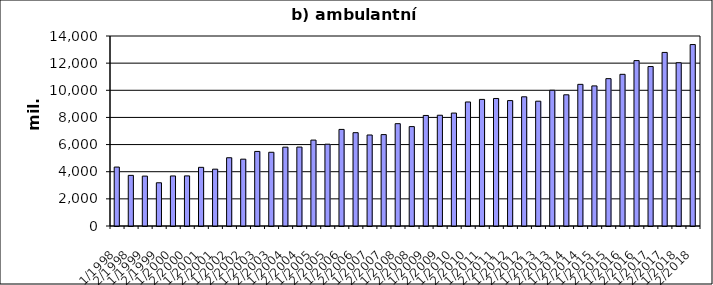
| Category | Series 0 |
|---|---|
| 1/1998 | 4342027.855 |
| 2/1998 | 3731300.066 |
| 1/1999 | 3676910.767 |
| 2/1999 | 3184787.233 |
| 1/2000 | 3686753.947 |
| 2/2000 | 3691319.853 |
| 1/2001 | 4322209 |
| 2/2001 | 4188036.612 |
| 1/2002 | 5029040 |
| 2/2002 | 4925039 |
| 1/2003 | 5495170 |
| 2/2003 | 5433023.58 |
| 1/2004 | 5809183 |
| 2/2004 | 5816278.502 |
| 1/2005 | 6331026 |
| 2/2005 | 6028037.834 |
| 1/2006 | 7116494 |
| 2/2006 | 6876376.9 |
| 1/2007 | 6706276 |
| 2/2007 | 6734099 |
| 1/2008 | 7539731.18 |
| 2/2008 | 7324007.82 |
| 1/2009 | 8145205 |
| 2/2009 | 8160835 |
| 1/2010 | 8321494 |
| 2/2010 | 9138261 |
| 1/2011 | 9328030 |
| 2/2011 | 9396413 |
| 1/2012 | 9241101 |
| 2/2012 | 9519860 |
| 1/2013 | 9196588 |
| 2/2013 | 10001827 |
| 1/2014 | 9666998 |
| 2/2014 | 10437312 |
| 1/2015 | 10323302 |
| 2/2015 | 10857585 |
| 1/2016 | 11176698 |
| 2/2016 | 12187566 |
| 1/2017 | 11749932 |
| 2/2017 | 12788960 |
| 1/2018 | 12029509.239 |
| 2/2018 | 13369883.483 |